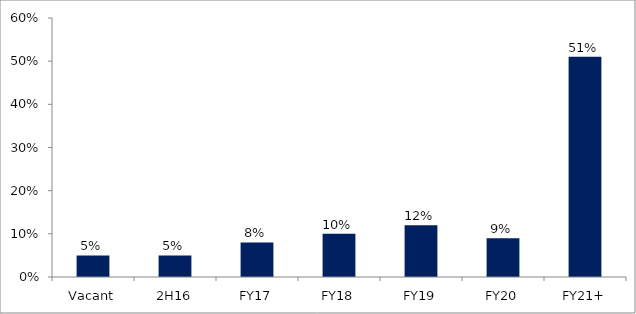
| Category | Series 0 |
|---|---|
| Vacant | 0.05 |
| 2H16 | 0.05 |
| FY17 | 0.08 |
| FY18 | 0.1 |
| FY19 | 0.12 |
| FY20 | 0.09 |
| FY21+ | 0.51 |